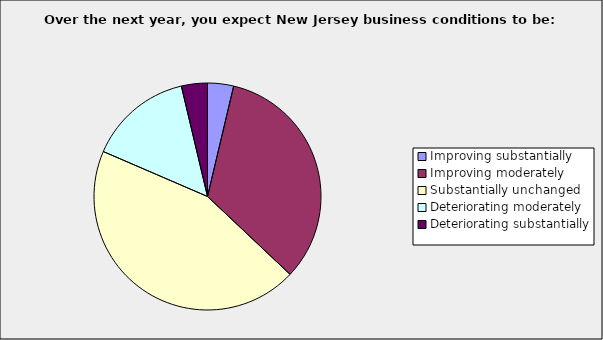
| Category | Series 0 |
|---|---|
| Improving substantially | 0.037 |
| Improving moderately | 0.333 |
| Substantially unchanged | 0.444 |
| Deteriorating moderately | 0.148 |
| Deteriorating substantially | 0.037 |